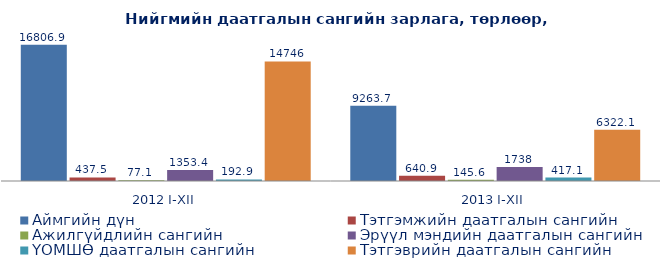
| Category | Аймгийн дүн | Тэтгэмжийн даатгалын сангийн | Ажилгүйдлийн сангийн  | Эрүүл мэндийн даатгалын сангийн | ҮОМШӨ даатгалын сангийн  | Тэтгэврийн даатгалын сангийн  |
|---|---|---|---|---|---|---|
| 2012 I-XII | 16806.9 | 437.5 | 77.1 | 1353.4 | 192.9 | 14746 |
| 2013 I-XII | 9263.7 | 640.9 | 145.6 | 1738 | 417.1 | 6322.1 |